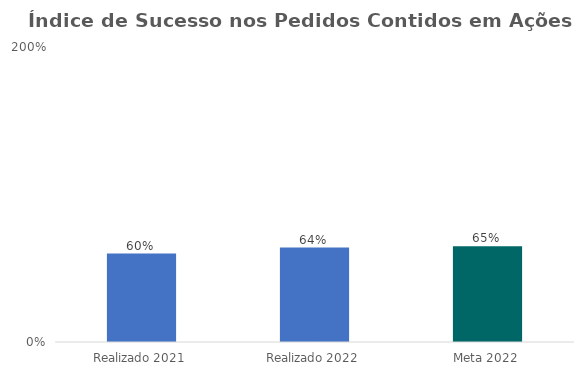
| Category | Índice de Sucesso nos Pedidos Contidos em Ações Judiciais |
|---|---|
| Realizado 2021 | 0.6 |
| Realizado 2022 | 0.64 |
| Meta 2022 | 0.65 |